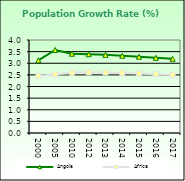
| Category | Angola | Africa  |
|---|---|---|
| 2000.0 | 3.127 | 2.458 |
| 2005.0 | 3.57 | 2.516 |
| 2010.0 | 3.411 | 2.59 |
| 2012.0 | 3.388 | 2.606 |
| 2013.0 | 3.361 | 2.601 |
| 2014.0 | 3.324 | 2.584 |
| 2015.0 | 3.279 | 2.559 |
| 2016.0 | 3.233 | 2.531 |
| 2017.0 | 3.192 | 2.503 |